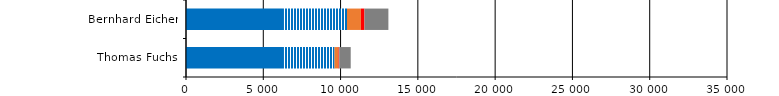
| Category | Series 0 | Series 1 | Series 2 | Series 3 | Series 4 | Series 5 | Series 6 |
|---|---|---|---|---|---|---|---|
| Bernhard Eicher | 6338 | 4078 | 0 | 899 | 230 | 2 | 1547 |
| Thomas Fuchs | 6338 | 3269 | 0 | 260 | 42 | 6 | 741 |